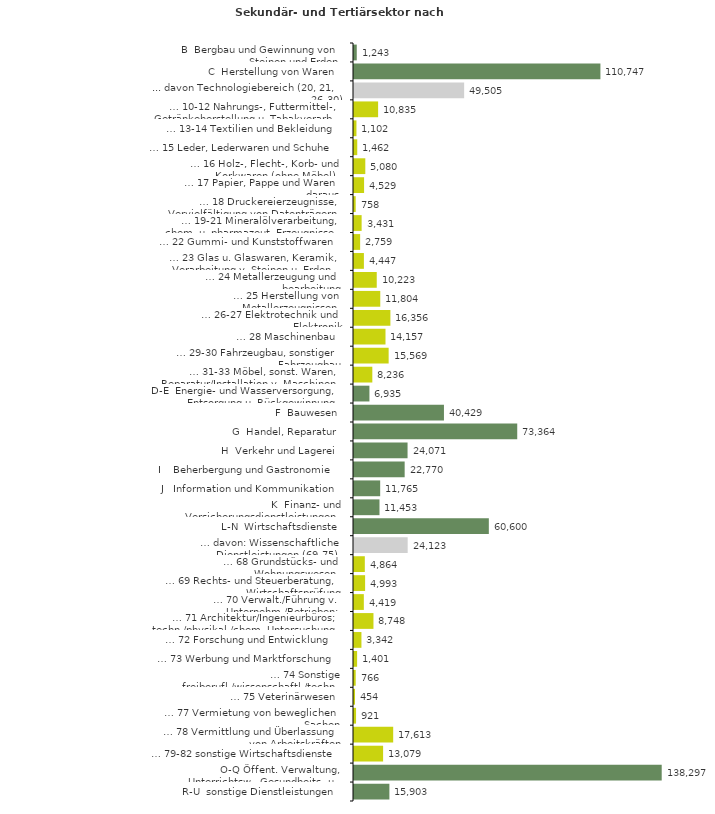
| Category | Series 0 |
|---|---|
| B  Bergbau und Gewinnung von Steinen und Erden | 1243 |
| C  Herstellung von Waren | 110747 |
| ... davon Technologiebereich (20, 21, 26-30) | 49505 |
| … 10-12 Nahrungs-, Futtermittel-, Getränkeherstellung u. Tabakverarb. | 10835 |
| … 13-14 Textilien und Bekleidung | 1102 |
| … 15 Leder, Lederwaren und Schuhe | 1462 |
| … 16 Holz-, Flecht-, Korb- und Korkwaren (ohne Möbel)  | 5080 |
| … 17 Papier, Pappe und Waren daraus  | 4529 |
| … 18 Druckereierzeugnisse, Vervielfältigung von Datenträgern | 758 |
| … 19-21 Mineralölverarbeitung, chem. u. pharmazeut. Erzeugnisse | 3431 |
| … 22 Gummi- und Kunststoffwaren | 2759 |
| … 23 Glas u. Glaswaren, Keramik, Verarbeitung v. Steinen u. Erden  | 4447 |
| … 24 Metallerzeugung und -bearbeitung | 10223 |
| … 25 Herstellung von Metallerzeugnissen  | 11804 |
| … 26-27 Elektrotechnik und Elektronik | 16356 |
| … 28 Maschinenbau | 14157 |
| … 29-30 Fahrzeugbau, sonstiger Fahrzeugbau | 15569 |
| … 31-33 Möbel, sonst. Waren, Reparatur/Installation v. Maschinen | 8236 |
| D-E  Energie- und Wasserversorgung, Entsorgung u. Rückgewinnung | 6935 |
| F  Bauwesen | 40429 |
| G  Handel, Reparatur | 73364 |
| H  Verkehr und Lagerei | 24071 |
| I    Beherbergung und Gastronomie | 22770 |
| J   Information und Kommunikation | 11765 |
| K  Finanz- und Versicherungsdienstleistungen | 11453 |
| L-N  Wirtschaftsdienste | 60600 |
| … davon: Wissenschaftliche Dienstleistungen (69-75) | 24123 |
| … 68 Grundstücks- und Wohnungswesen  | 4864 |
| … 69 Rechts- und Steuerberatung, Wirtschaftsprüfung | 4993 |
| … 70 Verwalt./Führung v. Unternehm./Betrieben; Unternehmensberat. | 4419 |
| … 71 Architektur/Ingenieurbüros; techn./physikal./chem. Untersuchung | 8748 |
| … 72 Forschung und Entwicklung  | 3342 |
| … 73 Werbung und Marktforschung | 1401 |
| … 74 Sonstige freiberufl./wissenschaftl./techn. Tätigkeiten | 766 |
| … 75 Veterinärwesen | 454 |
| … 77 Vermietung von beweglichen Sachen  | 921 |
| … 78 Vermittlung und Überlassung von Arbeitskräften | 17613 |
| … 79-82 sonstige Wirtschaftsdienste | 13079 |
| O-Q Öffent. Verwaltung, Unterrichtsw., Gesundheits- u. Sozialwesen | 138297 |
| R-U  sonstige Dienstleistungen | 15903 |